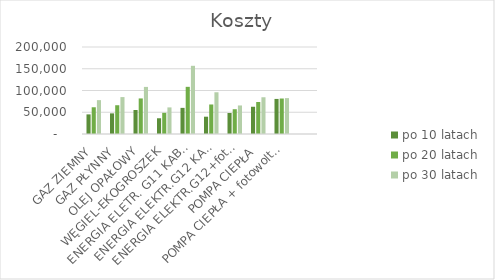
| Category | po 10 latach | po 20 latach | po 30 latach |
|---|---|---|---|
| GAZ ZIEMNY | 45080 | 61460 | 77840 |
| GAZ PŁYNNY | 47420 | 66140 | 84860 |
| OLEJ OPAŁOWY | 55220 | 81740 | 108260 |
| WĘGIEL-EKOGROSZEK | 36180 | 48660 | 61140 |
| ENERGIA ELETR. G11 KABLE | 60060 | 108420 | 156780 |
| ENERGIA ELEKTR.G12 KABLE | 39780 | 67860 | 95940 |
| ENERGIA ELEKTR.G12+fotowoltaika | 48340 | 56980 | 65620 |
| POMPA CIEPŁA | 62620 | 73540 | 84460 |
| POMPA CIEPŁA + fotowoltaika | 80630 | 81560 | 82490 |